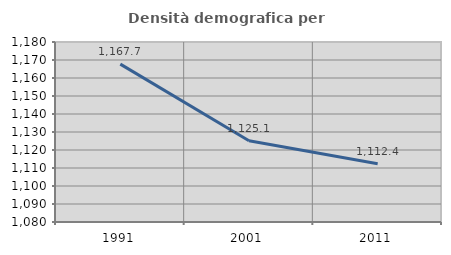
| Category | Densità demografica |
|---|---|
| 1991.0 | 1167.714 |
| 2001.0 | 1125.139 |
| 2011.0 | 1112.361 |